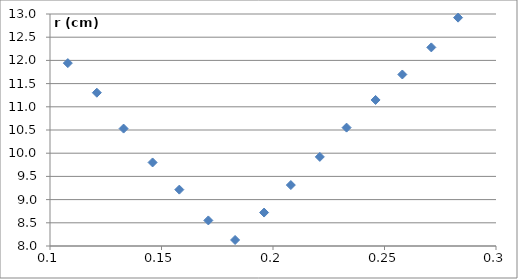
| Category | Series 0 |
|---|---|
| 0.096 | 12.632 |
| 0.108 | 11.942 |
| 0.121 | 11.304 |
| 0.133 | 10.531 |
| 0.146 | 9.801 |
| 0.158 | 9.215 |
| 0.171 | 8.551 |
| 0.183 | 8.13 |
| 0.196 | 8.721 |
| 0.208 | 9.314 |
| 0.221 | 9.92 |
| 0.233 | 10.551 |
| 0.246 | 11.147 |
| 0.258 | 11.696 |
| 0.271 | 12.28 |
| 0.283 | 12.921 |